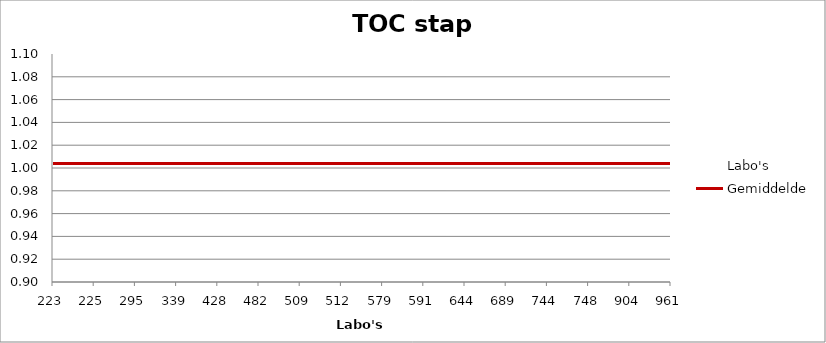
| Category | Labo's | Gemiddelde |
|---|---|---|
| 223.0 | 0.946 | 1.004 |
| 225.0 | 0.979 | 1.004 |
| 295.0 | 1.018 | 1.004 |
| 339.0 | 0.961 | 1.004 |
| 428.0 | 1.004 | 1.004 |
| 482.0 | 0.998 | 1.004 |
| 509.0 | 1.015 | 1.004 |
| 512.0 | 1.013 | 1.004 |
| 579.0 | 0.99 | 1.004 |
| 591.0 | 1 | 1.004 |
| 644.0 | 1.015 | 1.004 |
| 689.0 | 1.001 | 1.004 |
| 744.0 | 1.054 | 1.004 |
| 748.0 | 1.083 | 1.004 |
| 904.0 | 1.007 | 1.004 |
| 961.0 | 1.007 | 1.004 |